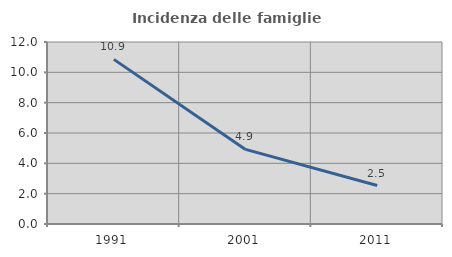
| Category | Incidenza delle famiglie numerose |
|---|---|
| 1991.0 | 10.855 |
| 2001.0 | 4.917 |
| 2011.0 | 2.535 |